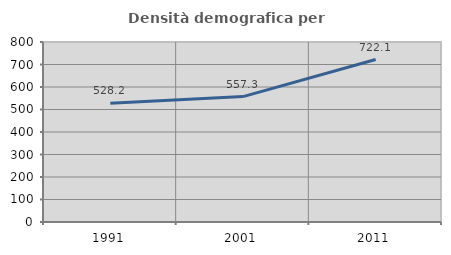
| Category | Densità demografica |
|---|---|
| 1991.0 | 528.172 |
| 2001.0 | 557.29 |
| 2011.0 | 722.131 |